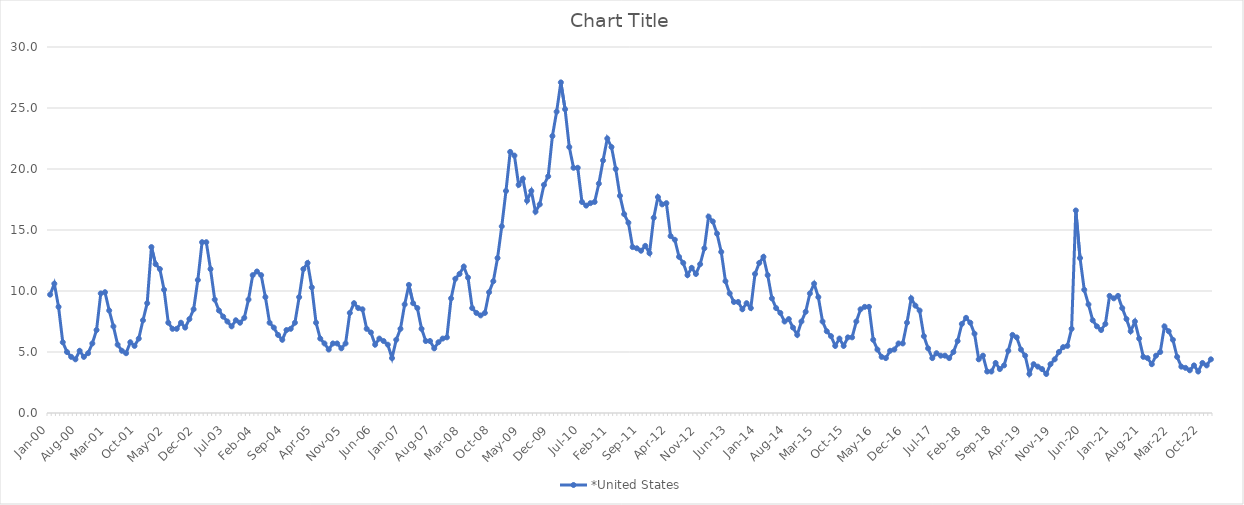
| Category | *United States | Alaska | Alabama | Arkansas | Arizona | California | Colorado | Connecticut | Delaware | Florida | Georgia | Hawaii | Iowa | Idaho | Illinois | Indiana | Kansas | Kentucky | Louisiana | Massachusetts | Maryland | Maine | Michigan | Minnesota | Missouri | Mississippi | Montana | North Carolina | North Dakota | Nebraska | New Hampshire | New Jersey | New Mexico | Nevada | New York | Ohio | Oklahoma | Oregon | Pennsylvania | Rhode Island | South Carolina | South Dakota | Tennessee | Texas | Utah | Virginia | Vermont | Washington | Wisconsin | West Virginia | Wyoming |
|---|---|---|---|---|---|---|---|---|---|---|---|---|---|---|---|---|---|---|---|---|---|---|---|---|---|---|---|---|---|---|---|---|---|---|---|---|---|---|---|---|---|---|---|---|---|---|---|---|---|---|---|
| Jan-00 | 9.7 |  |  |  |  |  |  |  |  |  |  |  |  |  |  |  |  |  |  |  |  |  |  |  |  |  |  |  |  |  |  |  |  |  |  |  |  |  |  |  |  |  |  |  |  |  |  |  |  |  |  |
| Feb-00 | 10.6 |  |  |  |  |  |  |  |  |  |  |  |  |  |  |  |  |  |  |  |  |  |  |  |  |  |  |  |  |  |  |  |  |  |  |  |  |  |  |  |  |  |  |  |  |  |  |  |  |  |  |
| Mar-00 | 8.7 |  |  |  |  |  |  |  |  |  |  |  |  |  |  |  |  |  |  |  |  |  |  |  |  |  |  |  |  |  |  |  |  |  |  |  |  |  |  |  |  |  |  |  |  |  |  |  |  |  |  |
| Apr-00 | 5.8 |  |  |  |  |  |  |  |  |  |  |  |  |  |  |  |  |  |  |  |  |  |  |  |  |  |  |  |  |  |  |  |  |  |  |  |  |  |  |  |  |  |  |  |  |  |  |  |  |  |  |
| May-00 | 5 |  |  |  |  |  |  |  |  |  |  |  |  |  |  |  |  |  |  |  |  |  |  |  |  |  |  |  |  |  |  |  |  |  |  |  |  |  |  |  |  |  |  |  |  |  |  |  |  |  |  |
| Jun-00 | 4.6 |  |  |  |  |  |  |  |  |  |  |  |  |  |  |  |  |  |  |  |  |  |  |  |  |  |  |  |  |  |  |  |  |  |  |  |  |  |  |  |  |  |  |  |  |  |  |  |  |  |  |
| Jul-00 | 4.4 |  |  |  |  |  |  |  |  |  |  |  |  |  |  |  |  |  |  |  |  |  |  |  |  |  |  |  |  |  |  |  |  |  |  |  |  |  |  |  |  |  |  |  |  |  |  |  |  |  |  |
| Aug-00 | 5.1 |  |  |  |  |  |  |  |  |  |  |  |  |  |  |  |  |  |  |  |  |  |  |  |  |  |  |  |  |  |  |  |  |  |  |  |  |  |  |  |  |  |  |  |  |  |  |  |  |  |  |
| Sep-00 | 4.6 |  |  |  |  |  |  |  |  |  |  |  |  |  |  |  |  |  |  |  |  |  |  |  |  |  |  |  |  |  |  |  |  |  |  |  |  |  |  |  |  |  |  |  |  |  |  |  |  |  |  |
| Oct-00 | 4.9 |  |  |  |  |  |  |  |  |  |  |  |  |  |  |  |  |  |  |  |  |  |  |  |  |  |  |  |  |  |  |  |  |  |  |  |  |  |  |  |  |  |  |  |  |  |  |  |  |  |  |
| Nov-00 | 5.7 |  |  |  |  |  |  |  |  |  |  |  |  |  |  |  |  |  |  |  |  |  |  |  |  |  |  |  |  |  |  |  |  |  |  |  |  |  |  |  |  |  |  |  |  |  |  |  |  |  |  |
| Dec-00 | 6.8 |  |  |  |  |  |  |  |  |  |  |  |  |  |  |  |  |  |  |  |  |  |  |  |  |  |  |  |  |  |  |  |  |  |  |  |  |  |  |  |  |  |  |  |  |  |  |  |  |  |  |
| Jan-01 | 9.8 |  |  |  |  |  |  |  |  |  |  |  |  |  |  |  |  |  |  |  |  |  |  |  |  |  |  |  |  |  |  |  |  |  |  |  |  |  |  |  |  |  |  |  |  |  |  |  |  |  |  |
| Feb-01 | 9.9 |  |  |  |  |  |  |  |  |  |  |  |  |  |  |  |  |  |  |  |  |  |  |  |  |  |  |  |  |  |  |  |  |  |  |  |  |  |  |  |  |  |  |  |  |  |  |  |  |  |  |
| Mar-01 | 8.4 |  |  |  |  |  |  |  |  |  |  |  |  |  |  |  |  |  |  |  |  |  |  |  |  |  |  |  |  |  |  |  |  |  |  |  |  |  |  |  |  |  |  |  |  |  |  |  |  |  |  |
| Apr-01 | 7.1 |  |  |  |  |  |  |  |  |  |  |  |  |  |  |  |  |  |  |  |  |  |  |  |  |  |  |  |  |  |  |  |  |  |  |  |  |  |  |  |  |  |  |  |  |  |  |  |  |  |  |
| May-01 | 5.6 |  |  |  |  |  |  |  |  |  |  |  |  |  |  |  |  |  |  |  |  |  |  |  |  |  |  |  |  |  |  |  |  |  |  |  |  |  |  |  |  |  |  |  |  |  |  |  |  |  |  |
| Jun-01 | 5.1 |  |  |  |  |  |  |  |  |  |  |  |  |  |  |  |  |  |  |  |  |  |  |  |  |  |  |  |  |  |  |  |  |  |  |  |  |  |  |  |  |  |  |  |  |  |  |  |  |  |  |
| Jul-01 | 4.9 |  |  |  |  |  |  |  |  |  |  |  |  |  |  |  |  |  |  |  |  |  |  |  |  |  |  |  |  |  |  |  |  |  |  |  |  |  |  |  |  |  |  |  |  |  |  |  |  |  |  |
| Aug-01 | 5.8 |  |  |  |  |  |  |  |  |  |  |  |  |  |  |  |  |  |  |  |  |  |  |  |  |  |  |  |  |  |  |  |  |  |  |  |  |  |  |  |  |  |  |  |  |  |  |  |  |  |  |
| Sep-01 | 5.5 |  |  |  |  |  |  |  |  |  |  |  |  |  |  |  |  |  |  |  |  |  |  |  |  |  |  |  |  |  |  |  |  |  |  |  |  |  |  |  |  |  |  |  |  |  |  |  |  |  |  |
| Oct-01 | 6.1 |  |  |  |  |  |  |  |  |  |  |  |  |  |  |  |  |  |  |  |  |  |  |  |  |  |  |  |  |  |  |  |  |  |  |  |  |  |  |  |  |  |  |  |  |  |  |  |  |  |  |
| Nov-01 | 7.6 |  |  |  |  |  |  |  |  |  |  |  |  |  |  |  |  |  |  |  |  |  |  |  |  |  |  |  |  |  |  |  |  |  |  |  |  |  |  |  |  |  |  |  |  |  |  |  |  |  |  |
| Dec-01 | 9 |  |  |  |  |  |  |  |  |  |  |  |  |  |  |  |  |  |  |  |  |  |  |  |  |  |  |  |  |  |  |  |  |  |  |  |  |  |  |  |  |  |  |  |  |  |  |  |  |  |  |
| Jan-02 | 13.6 |  |  |  |  |  |  |  |  |  |  |  |  |  |  |  |  |  |  |  |  |  |  |  |  |  |  |  |  |  |  |  |  |  |  |  |  |  |  |  |  |  |  |  |  |  |  |  |  |  |  |
| Feb-02 | 12.2 |  |  |  |  |  |  |  |  |  |  |  |  |  |  |  |  |  |  |  |  |  |  |  |  |  |  |  |  |  |  |  |  |  |  |  |  |  |  |  |  |  |  |  |  |  |  |  |  |  |  |
| Mar-02 | 11.8 |  |  |  |  |  |  |  |  |  |  |  |  |  |  |  |  |  |  |  |  |  |  |  |  |  |  |  |  |  |  |  |  |  |  |  |  |  |  |  |  |  |  |  |  |  |  |  |  |  |  |
| Apr-02 | 10.1 |  |  |  |  |  |  |  |  |  |  |  |  |  |  |  |  |  |  |  |  |  |  |  |  |  |  |  |  |  |  |  |  |  |  |  |  |  |  |  |  |  |  |  |  |  |  |  |  |  |  |
| May-02 | 7.4 |  |  |  |  |  |  |  |  |  |  |  |  |  |  |  |  |  |  |  |  |  |  |  |  |  |  |  |  |  |  |  |  |  |  |  |  |  |  |  |  |  |  |  |  |  |  |  |  |  |  |
| Jun-02 | 6.9 |  |  |  |  |  |  |  |  |  |  |  |  |  |  |  |  |  |  |  |  |  |  |  |  |  |  |  |  |  |  |  |  |  |  |  |  |  |  |  |  |  |  |  |  |  |  |  |  |  |  |
| Jul-02 | 6.9 |  |  |  |  |  |  |  |  |  |  |  |  |  |  |  |  |  |  |  |  |  |  |  |  |  |  |  |  |  |  |  |  |  |  |  |  |  |  |  |  |  |  |  |  |  |  |  |  |  |  |
| Aug-02 | 7.4 |  |  |  |  |  |  |  |  |  |  |  |  |  |  |  |  |  |  |  |  |  |  |  |  |  |  |  |  |  |  |  |  |  |  |  |  |  |  |  |  |  |  |  |  |  |  |  |  |  |  |
| Sep-02 | 7 |  |  |  |  |  |  |  |  |  |  |  |  |  |  |  |  |  |  |  |  |  |  |  |  |  |  |  |  |  |  |  |  |  |  |  |  |  |  |  |  |  |  |  |  |  |  |  |  |  |  |
| Oct-02 | 7.7 |  |  |  |  |  |  |  |  |  |  |  |  |  |  |  |  |  |  |  |  |  |  |  |  |  |  |  |  |  |  |  |  |  |  |  |  |  |  |  |  |  |  |  |  |  |  |  |  |  |  |
| Nov-02 | 8.5 |  |  |  |  |  |  |  |  |  |  |  |  |  |  |  |  |  |  |  |  |  |  |  |  |  |  |  |  |  |  |  |  |  |  |  |  |  |  |  |  |  |  |  |  |  |  |  |  |  |  |
| Dec-02 | 10.9 |  |  |  |  |  |  |  |  |  |  |  |  |  |  |  |  |  |  |  |  |  |  |  |  |  |  |  |  |  |  |  |  |  |  |  |  |  |  |  |  |  |  |  |  |  |  |  |  |  |  |
| Jan-03 | 14 |  |  |  |  |  |  |  |  |  |  |  |  |  |  |  |  |  |  |  |  |  |  |  |  |  |  |  |  |  |  |  |  |  |  |  |  |  |  |  |  |  |  |  |  |  |  |  |  |  |  |
| Feb-03 | 14 |  |  |  |  |  |  |  |  |  |  |  |  |  |  |  |  |  |  |  |  |  |  |  |  |  |  |  |  |  |  |  |  |  |  |  |  |  |  |  |  |  |  |  |  |  |  |  |  |  |  |
| Mar-03 | 11.8 |  |  |  |  |  |  |  |  |  |  |  |  |  |  |  |  |  |  |  |  |  |  |  |  |  |  |  |  |  |  |  |  |  |  |  |  |  |  |  |  |  |  |  |  |  |  |  |  |  |  |
| Apr-03 | 9.3 |  |  |  |  |  |  |  |  |  |  |  |  |  |  |  |  |  |  |  |  |  |  |  |  |  |  |  |  |  |  |  |  |  |  |  |  |  |  |  |  |  |  |  |  |  |  |  |  |  |  |
| May-03 | 8.4 |  |  |  |  |  |  |  |  |  |  |  |  |  |  |  |  |  |  |  |  |  |  |  |  |  |  |  |  |  |  |  |  |  |  |  |  |  |  |  |  |  |  |  |  |  |  |  |  |  |  |
| Jun-03 | 7.9 |  |  |  |  |  |  |  |  |  |  |  |  |  |  |  |  |  |  |  |  |  |  |  |  |  |  |  |  |  |  |  |  |  |  |  |  |  |  |  |  |  |  |  |  |  |  |  |  |  |  |
| Jul-03 | 7.5 |  |  |  |  |  |  |  |  |  |  |  |  |  |  |  |  |  |  |  |  |  |  |  |  |  |  |  |  |  |  |  |  |  |  |  |  |  |  |  |  |  |  |  |  |  |  |  |  |  |  |
| Aug-03 | 7.1 |  |  |  |  |  |  |  |  |  |  |  |  |  |  |  |  |  |  |  |  |  |  |  |  |  |  |  |  |  |  |  |  |  |  |  |  |  |  |  |  |  |  |  |  |  |  |  |  |  |  |
| Sep-03 | 7.6 |  |  |  |  |  |  |  |  |  |  |  |  |  |  |  |  |  |  |  |  |  |  |  |  |  |  |  |  |  |  |  |  |  |  |  |  |  |  |  |  |  |  |  |  |  |  |  |  |  |  |
| Oct-03 | 7.4 |  |  |  |  |  |  |  |  |  |  |  |  |  |  |  |  |  |  |  |  |  |  |  |  |  |  |  |  |  |  |  |  |  |  |  |  |  |  |  |  |  |  |  |  |  |  |  |  |  |  |
| Nov-03 | 7.8 |  |  |  |  |  |  |  |  |  |  |  |  |  |  |  |  |  |  |  |  |  |  |  |  |  |  |  |  |  |  |  |  |  |  |  |  |  |  |  |  |  |  |  |  |  |  |  |  |  |  |
| Dec-03 | 9.3 |  |  |  |  |  |  |  |  |  |  |  |  |  |  |  |  |  |  |  |  |  |  |  |  |  |  |  |  |  |  |  |  |  |  |  |  |  |  |  |  |  |  |  |  |  |  |  |  |  |  |
| Jan-04 | 11.3 |  |  |  |  |  |  |  |  |  |  |  |  |  |  |  |  |  |  |  |  |  |  |  |  |  |  |  |  |  |  |  |  |  |  |  |  |  |  |  |  |  |  |  |  |  |  |  |  |  |  |
| Feb-04 | 11.6 |  |  |  |  |  |  |  |  |  |  |  |  |  |  |  |  |  |  |  |  |  |  |  |  |  |  |  |  |  |  |  |  |  |  |  |  |  |  |  |  |  |  |  |  |  |  |  |  |  |  |
| Mar-04 | 11.3 |  |  |  |  |  |  |  |  |  |  |  |  |  |  |  |  |  |  |  |  |  |  |  |  |  |  |  |  |  |  |  |  |  |  |  |  |  |  |  |  |  |  |  |  |  |  |  |  |  |  |
| Apr-04 | 9.5 |  |  |  |  |  |  |  |  |  |  |  |  |  |  |  |  |  |  |  |  |  |  |  |  |  |  |  |  |  |  |  |  |  |  |  |  |  |  |  |  |  |  |  |  |  |  |  |  |  |  |
| May-04 | 7.4 |  |  |  |  |  |  |  |  |  |  |  |  |  |  |  |  |  |  |  |  |  |  |  |  |  |  |  |  |  |  |  |  |  |  |  |  |  |  |  |  |  |  |  |  |  |  |  |  |  |  |
| Jun-04 | 7 |  |  |  |  |  |  |  |  |  |  |  |  |  |  |  |  |  |  |  |  |  |  |  |  |  |  |  |  |  |  |  |  |  |  |  |  |  |  |  |  |  |  |  |  |  |  |  |  |  |  |
| Jul-04 | 6.4 |  |  |  |  |  |  |  |  |  |  |  |  |  |  |  |  |  |  |  |  |  |  |  |  |  |  |  |  |  |  |  |  |  |  |  |  |  |  |  |  |  |  |  |  |  |  |  |  |  |  |
| Aug-04 | 6 |  |  |  |  |  |  |  |  |  |  |  |  |  |  |  |  |  |  |  |  |  |  |  |  |  |  |  |  |  |  |  |  |  |  |  |  |  |  |  |  |  |  |  |  |  |  |  |  |  |  |
| Sep-04 | 6.8 |  |  |  |  |  |  |  |  |  |  |  |  |  |  |  |  |  |  |  |  |  |  |  |  |  |  |  |  |  |  |  |  |  |  |  |  |  |  |  |  |  |  |  |  |  |  |  |  |  |  |
| Oct-04 | 6.9 |  |  |  |  |  |  |  |  |  |  |  |  |  |  |  |  |  |  |  |  |  |  |  |  |  |  |  |  |  |  |  |  |  |  |  |  |  |  |  |  |  |  |  |  |  |  |  |  |  |  |
| Nov-04 | 7.4 |  |  |  |  |  |  |  |  |  |  |  |  |  |  |  |  |  |  |  |  |  |  |  |  |  |  |  |  |  |  |  |  |  |  |  |  |  |  |  |  |  |  |  |  |  |  |  |  |  |  |
| Dec-04 | 9.5 |  |  |  |  |  |  |  |  |  |  |  |  |  |  |  |  |  |  |  |  |  |  |  |  |  |  |  |  |  |  |  |  |  |  |  |  |  |  |  |  |  |  |  |  |  |  |  |  |  |  |
| Jan-05 | 11.8 |  |  |  |  |  |  |  |  |  |  |  |  |  |  |  |  |  |  |  |  |  |  |  |  |  |  |  |  |  |  |  |  |  |  |  |  |  |  |  |  |  |  |  |  |  |  |  |  |  |  |
| Feb-05 | 12.3 |  |  |  |  |  |  |  |  |  |  |  |  |  |  |  |  |  |  |  |  |  |  |  |  |  |  |  |  |  |  |  |  |  |  |  |  |  |  |  |  |  |  |  |  |  |  |  |  |  |  |
| Mar-05 | 10.3 |  |  |  |  |  |  |  |  |  |  |  |  |  |  |  |  |  |  |  |  |  |  |  |  |  |  |  |  |  |  |  |  |  |  |  |  |  |  |  |  |  |  |  |  |  |  |  |  |  |  |
| Apr-05 | 7.4 |  |  |  |  |  |  |  |  |  |  |  |  |  |  |  |  |  |  |  |  |  |  |  |  |  |  |  |  |  |  |  |  |  |  |  |  |  |  |  |  |  |  |  |  |  |  |  |  |  |  |
| May-05 | 6.1 |  |  |  |  |  |  |  |  |  |  |  |  |  |  |  |  |  |  |  |  |  |  |  |  |  |  |  |  |  |  |  |  |  |  |  |  |  |  |  |  |  |  |  |  |  |  |  |  |  |  |
| Jun-05 | 5.7 |  |  |  |  |  |  |  |  |  |  |  |  |  |  |  |  |  |  |  |  |  |  |  |  |  |  |  |  |  |  |  |  |  |  |  |  |  |  |  |  |  |  |  |  |  |  |  |  |  |  |
| Jul-05 | 5.2 |  |  |  |  |  |  |  |  |  |  |  |  |  |  |  |  |  |  |  |  |  |  |  |  |  |  |  |  |  |  |  |  |  |  |  |  |  |  |  |  |  |  |  |  |  |  |  |  |  |  |
| Aug-05 | 5.7 |  |  |  |  |  |  |  |  |  |  |  |  |  |  |  |  |  |  |  |  |  |  |  |  |  |  |  |  |  |  |  |  |  |  |  |  |  |  |  |  |  |  |  |  |  |  |  |  |  |  |
| Sep-05 | 5.7 |  |  |  |  |  |  |  |  |  |  |  |  |  |  |  |  |  |  |  |  |  |  |  |  |  |  |  |  |  |  |  |  |  |  |  |  |  |  |  |  |  |  |  |  |  |  |  |  |  |  |
| Oct-05 | 5.3 |  |  |  |  |  |  |  |  |  |  |  |  |  |  |  |  |  |  |  |  |  |  |  |  |  |  |  |  |  |  |  |  |  |  |  |  |  |  |  |  |  |  |  |  |  |  |  |  |  |  |
| Nov-05 | 5.7 |  |  |  |  |  |  |  |  |  |  |  |  |  |  |  |  |  |  |  |  |  |  |  |  |  |  |  |  |  |  |  |  |  |  |  |  |  |  |  |  |  |  |  |  |  |  |  |  |  |  |
| Dec-05 | 8.2 |  |  |  |  |  |  |  |  |  |  |  |  |  |  |  |  |  |  |  |  |  |  |  |  |  |  |  |  |  |  |  |  |  |  |  |  |  |  |  |  |  |  |  |  |  |  |  |  |  |  |
| Jan-06 | 9 |  |  |  |  |  |  |  |  |  |  |  |  |  |  |  |  |  |  |  |  |  |  |  |  |  |  |  |  |  |  |  |  |  |  |  |  |  |  |  |  |  |  |  |  |  |  |  |  |  |  |
| Feb-06 | 8.6 |  |  |  |  |  |  |  |  |  |  |  |  |  |  |  |  |  |  |  |  |  |  |  |  |  |  |  |  |  |  |  |  |  |  |  |  |  |  |  |  |  |  |  |  |  |  |  |  |  |  |
| Mar-06 | 8.5 |  |  |  |  |  |  |  |  |  |  |  |  |  |  |  |  |  |  |  |  |  |  |  |  |  |  |  |  |  |  |  |  |  |  |  |  |  |  |  |  |  |  |  |  |  |  |  |  |  |  |
| Apr-06 | 6.9 |  |  |  |  |  |  |  |  |  |  |  |  |  |  |  |  |  |  |  |  |  |  |  |  |  |  |  |  |  |  |  |  |  |  |  |  |  |  |  |  |  |  |  |  |  |  |  |  |  |  |
| May-06 | 6.6 |  |  |  |  |  |  |  |  |  |  |  |  |  |  |  |  |  |  |  |  |  |  |  |  |  |  |  |  |  |  |  |  |  |  |  |  |  |  |  |  |  |  |  |  |  |  |  |  |  |  |
| Jun-06 | 5.6 |  |  |  |  |  |  |  |  |  |  |  |  |  |  |  |  |  |  |  |  |  |  |  |  |  |  |  |  |  |  |  |  |  |  |  |  |  |  |  |  |  |  |  |  |  |  |  |  |  |  |
| Jul-06 | 6.1 |  |  |  |  |  |  |  |  |  |  |  |  |  |  |  |  |  |  |  |  |  |  |  |  |  |  |  |  |  |  |  |  |  |  |  |  |  |  |  |  |  |  |  |  |  |  |  |  |  |  |
| Aug-06 | 5.9 |  |  |  |  |  |  |  |  |  |  |  |  |  |  |  |  |  |  |  |  |  |  |  |  |  |  |  |  |  |  |  |  |  |  |  |  |  |  |  |  |  |  |  |  |  |  |  |  |  |  |
| Sep-06 | 5.6 |  |  |  |  |  |  |  |  |  |  |  |  |  |  |  |  |  |  |  |  |  |  |  |  |  |  |  |  |  |  |  |  |  |  |  |  |  |  |  |  |  |  |  |  |  |  |  |  |  |  |
| Oct-06 | 4.5 |  |  |  |  |  |  |  |  |  |  |  |  |  |  |  |  |  |  |  |  |  |  |  |  |  |  |  |  |  |  |  |  |  |  |  |  |  |  |  |  |  |  |  |  |  |  |  |  |  |  |
| Nov-06 | 6 |  |  |  |  |  |  |  |  |  |  |  |  |  |  |  |  |  |  |  |  |  |  |  |  |  |  |  |  |  |  |  |  |  |  |  |  |  |  |  |  |  |  |  |  |  |  |  |  |  |  |
| Dec-06 | 6.9 |  |  |  |  |  |  |  |  |  |  |  |  |  |  |  |  |  |  |  |  |  |  |  |  |  |  |  |  |  |  |  |  |  |  |  |  |  |  |  |  |  |  |  |  |  |  |  |  |  |  |
| Jan-07 | 8.9 |  |  |  |  |  |  |  |  |  |  |  |  |  |  |  |  |  |  |  |  |  |  |  |  |  |  |  |  |  |  |  |  |  |  |  |  |  |  |  |  |  |  |  |  |  |  |  |  |  |  |
| Feb-07 | 10.5 |  |  |  |  |  |  |  |  |  |  |  |  |  |  |  |  |  |  |  |  |  |  |  |  |  |  |  |  |  |  |  |  |  |  |  |  |  |  |  |  |  |  |  |  |  |  |  |  |  |  |
| Mar-07 | 9 |  |  |  |  |  |  |  |  |  |  |  |  |  |  |  |  |  |  |  |  |  |  |  |  |  |  |  |  |  |  |  |  |  |  |  |  |  |  |  |  |  |  |  |  |  |  |  |  |  |  |
| Apr-07 | 8.6 |  |  |  |  |  |  |  |  |  |  |  |  |  |  |  |  |  |  |  |  |  |  |  |  |  |  |  |  |  |  |  |  |  |  |  |  |  |  |  |  |  |  |  |  |  |  |  |  |  |  |
| May-07 | 6.9 |  |  |  |  |  |  |  |  |  |  |  |  |  |  |  |  |  |  |  |  |  |  |  |  |  |  |  |  |  |  |  |  |  |  |  |  |  |  |  |  |  |  |  |  |  |  |  |  |  |  |
| Jun-07 | 5.9 |  |  |  |  |  |  |  |  |  |  |  |  |  |  |  |  |  |  |  |  |  |  |  |  |  |  |  |  |  |  |  |  |  |  |  |  |  |  |  |  |  |  |  |  |  |  |  |  |  |  |
| Jul-07 | 5.9 |  |  |  |  |  |  |  |  |  |  |  |  |  |  |  |  |  |  |  |  |  |  |  |  |  |  |  |  |  |  |  |  |  |  |  |  |  |  |  |  |  |  |  |  |  |  |  |  |  |  |
| Aug-07 | 5.3 |  |  |  |  |  |  |  |  |  |  |  |  |  |  |  |  |  |  |  |  |  |  |  |  |  |  |  |  |  |  |  |  |  |  |  |  |  |  |  |  |  |  |  |  |  |  |  |  |  |  |
| Sep-07 | 5.8 |  |  |  |  |  |  |  |  |  |  |  |  |  |  |  |  |  |  |  |  |  |  |  |  |  |  |  |  |  |  |  |  |  |  |  |  |  |  |  |  |  |  |  |  |  |  |  |  |  |  |
| Oct-07 | 6.1 |  |  |  |  |  |  |  |  |  |  |  |  |  |  |  |  |  |  |  |  |  |  |  |  |  |  |  |  |  |  |  |  |  |  |  |  |  |  |  |  |  |  |  |  |  |  |  |  |  |  |
| Nov-07 | 6.2 |  |  |  |  |  |  |  |  |  |  |  |  |  |  |  |  |  |  |  |  |  |  |  |  |  |  |  |  |  |  |  |  |  |  |  |  |  |  |  |  |  |  |  |  |  |  |  |  |  |  |
| Dec-07 | 9.4 |  |  |  |  |  |  |  |  |  |  |  |  |  |  |  |  |  |  |  |  |  |  |  |  |  |  |  |  |  |  |  |  |  |  |  |  |  |  |  |  |  |  |  |  |  |  |  |  |  |  |
| Jan-08 | 11 |  |  |  |  |  |  |  |  |  |  |  |  |  |  |  |  |  |  |  |  |  |  |  |  |  |  |  |  |  |  |  |  |  |  |  |  |  |  |  |  |  |  |  |  |  |  |  |  |  |  |
| Feb-08 | 11.4 |  |  |  |  |  |  |  |  |  |  |  |  |  |  |  |  |  |  |  |  |  |  |  |  |  |  |  |  |  |  |  |  |  |  |  |  |  |  |  |  |  |  |  |  |  |  |  |  |  |  |
| Mar-08 | 12 |  |  |  |  |  |  |  |  |  |  |  |  |  |  |  |  |  |  |  |  |  |  |  |  |  |  |  |  |  |  |  |  |  |  |  |  |  |  |  |  |  |  |  |  |  |  |  |  |  |  |
| Apr-08 | 11.1 |  |  |  |  |  |  |  |  |  |  |  |  |  |  |  |  |  |  |  |  |  |  |  |  |  |  |  |  |  |  |  |  |  |  |  |  |  |  |  |  |  |  |  |  |  |  |  |  |  |  |
| May-08 | 8.6 |  |  |  |  |  |  |  |  |  |  |  |  |  |  |  |  |  |  |  |  |  |  |  |  |  |  |  |  |  |  |  |  |  |  |  |  |  |  |  |  |  |  |  |  |  |  |  |  |  |  |
| Jun-08 | 8.2 |  |  |  |  |  |  |  |  |  |  |  |  |  |  |  |  |  |  |  |  |  |  |  |  |  |  |  |  |  |  |  |  |  |  |  |  |  |  |  |  |  |  |  |  |  |  |  |  |  |  |
| Jul-08 | 8 |  |  |  |  |  |  |  |  |  |  |  |  |  |  |  |  |  |  |  |  |  |  |  |  |  |  |  |  |  |  |  |  |  |  |  |  |  |  |  |  |  |  |  |  |  |  |  |  |  |  |
| Aug-08 | 8.2 |  |  |  |  |  |  |  |  |  |  |  |  |  |  |  |  |  |  |  |  |  |  |  |  |  |  |  |  |  |  |  |  |  |  |  |  |  |  |  |  |  |  |  |  |  |  |  |  |  |  |
| Sep-08 | 9.9 |  |  |  |  |  |  |  |  |  |  |  |  |  |  |  |  |  |  |  |  |  |  |  |  |  |  |  |  |  |  |  |  |  |  |  |  |  |  |  |  |  |  |  |  |  |  |  |  |  |  |
| Oct-08 | 10.8 |  |  |  |  |  |  |  |  |  |  |  |  |  |  |  |  |  |  |  |  |  |  |  |  |  |  |  |  |  |  |  |  |  |  |  |  |  |  |  |  |  |  |  |  |  |  |  |  |  |  |
| Nov-08 | 12.7 |  |  |  |  |  |  |  |  |  |  |  |  |  |  |  |  |  |  |  |  |  |  |  |  |  |  |  |  |  |  |  |  |  |  |  |  |  |  |  |  |  |  |  |  |  |  |  |  |  |  |
| Dec-08 | 15.3 |  |  |  |  |  |  |  |  |  |  |  |  |  |  |  |  |  |  |  |  |  |  |  |  |  |  |  |  |  |  |  |  |  |  |  |  |  |  |  |  |  |  |  |  |  |  |  |  |  |  |
| Jan-09 | 18.2 |  |  |  |  |  |  |  |  |  |  |  |  |  |  |  |  |  |  |  |  |  |  |  |  |  |  |  |  |  |  |  |  |  |  |  |  |  |  |  |  |  |  |  |  |  |  |  |  |  |  |
| Feb-09 | 21.4 |  |  |  |  |  |  |  |  |  |  |  |  |  |  |  |  |  |  |  |  |  |  |  |  |  |  |  |  |  |  |  |  |  |  |  |  |  |  |  |  |  |  |  |  |  |  |  |  |  |  |
| Mar-09 | 21.1 |  |  |  |  |  |  |  |  |  |  |  |  |  |  |  |  |  |  |  |  |  |  |  |  |  |  |  |  |  |  |  |  |  |  |  |  |  |  |  |  |  |  |  |  |  |  |  |  |  |  |
| Apr-09 | 18.7 |  |  |  |  |  |  |  |  |  |  |  |  |  |  |  |  |  |  |  |  |  |  |  |  |  |  |  |  |  |  |  |  |  |  |  |  |  |  |  |  |  |  |  |  |  |  |  |  |  |  |
| May-09 | 19.2 |  |  |  |  |  |  |  |  |  |  |  |  |  |  |  |  |  |  |  |  |  |  |  |  |  |  |  |  |  |  |  |  |  |  |  |  |  |  |  |  |  |  |  |  |  |  |  |  |  |  |
| Jun-09 | 17.4 |  |  |  |  |  |  |  |  |  |  |  |  |  |  |  |  |  |  |  |  |  |  |  |  |  |  |  |  |  |  |  |  |  |  |  |  |  |  |  |  |  |  |  |  |  |  |  |  |  |  |
| Jul-09 | 18.2 |  |  |  |  |  |  |  |  |  |  |  |  |  |  |  |  |  |  |  |  |  |  |  |  |  |  |  |  |  |  |  |  |  |  |  |  |  |  |  |  |  |  |  |  |  |  |  |  |  |  |
| Aug-09 | 16.5 |  |  |  |  |  |  |  |  |  |  |  |  |  |  |  |  |  |  |  |  |  |  |  |  |  |  |  |  |  |  |  |  |  |  |  |  |  |  |  |  |  |  |  |  |  |  |  |  |  |  |
| Sep-09 | 17.1 |  |  |  |  |  |  |  |  |  |  |  |  |  |  |  |  |  |  |  |  |  |  |  |  |  |  |  |  |  |  |  |  |  |  |  |  |  |  |  |  |  |  |  |  |  |  |  |  |  |  |
| Oct-09 | 18.7 |  |  |  |  |  |  |  |  |  |  |  |  |  |  |  |  |  |  |  |  |  |  |  |  |  |  |  |  |  |  |  |  |  |  |  |  |  |  |  |  |  |  |  |  |  |  |  |  |  |  |
| Nov-09 | 19.4 |  |  |  |  |  |  |  |  |  |  |  |  |  |  |  |  |  |  |  |  |  |  |  |  |  |  |  |  |  |  |  |  |  |  |  |  |  |  |  |  |  |  |  |  |  |  |  |  |  |  |
| Dec-09 | 22.7 |  |  |  |  |  |  |  |  |  |  |  |  |  |  |  |  |  |  |  |  |  |  |  |  |  |  |  |  |  |  |  |  |  |  |  |  |  |  |  |  |  |  |  |  |  |  |  |  |  |  |
| Jan-10 | 24.7 |  |  |  |  |  |  |  |  |  |  |  |  |  |  |  |  |  |  |  |  |  |  |  |  |  |  |  |  |  |  |  |  |  |  |  |  |  |  |  |  |  |  |  |  |  |  |  |  |  |  |
| Feb-10 | 27.1 |  |  |  |  |  |  |  |  |  |  |  |  |  |  |  |  |  |  |  |  |  |  |  |  |  |  |  |  |  |  |  |  |  |  |  |  |  |  |  |  |  |  |  |  |  |  |  |  |  |  |
| Mar-10 | 24.9 |  |  |  |  |  |  |  |  |  |  |  |  |  |  |  |  |  |  |  |  |  |  |  |  |  |  |  |  |  |  |  |  |  |  |  |  |  |  |  |  |  |  |  |  |  |  |  |  |  |  |
| Apr-10 | 21.8 |  |  |  |  |  |  |  |  |  |  |  |  |  |  |  |  |  |  |  |  |  |  |  |  |  |  |  |  |  |  |  |  |  |  |  |  |  |  |  |  |  |  |  |  |  |  |  |  |  |  |
| May-10 | 20.1 |  |  |  |  |  |  |  |  |  |  |  |  |  |  |  |  |  |  |  |  |  |  |  |  |  |  |  |  |  |  |  |  |  |  |  |  |  |  |  |  |  |  |  |  |  |  |  |  |  |  |
| Jun-10 | 20.1 |  |  |  |  |  |  |  |  |  |  |  |  |  |  |  |  |  |  |  |  |  |  |  |  |  |  |  |  |  |  |  |  |  |  |  |  |  |  |  |  |  |  |  |  |  |  |  |  |  |  |
| Jul-10 | 17.3 |  |  |  |  |  |  |  |  |  |  |  |  |  |  |  |  |  |  |  |  |  |  |  |  |  |  |  |  |  |  |  |  |  |  |  |  |  |  |  |  |  |  |  |  |  |  |  |  |  |  |
| Aug-10 | 17 |  |  |  |  |  |  |  |  |  |  |  |  |  |  |  |  |  |  |  |  |  |  |  |  |  |  |  |  |  |  |  |  |  |  |  |  |  |  |  |  |  |  |  |  |  |  |  |  |  |  |
| Sep-10 | 17.2 |  |  |  |  |  |  |  |  |  |  |  |  |  |  |  |  |  |  |  |  |  |  |  |  |  |  |  |  |  |  |  |  |  |  |  |  |  |  |  |  |  |  |  |  |  |  |  |  |  |  |
| Oct-10 | 17.3 |  |  |  |  |  |  |  |  |  |  |  |  |  |  |  |  |  |  |  |  |  |  |  |  |  |  |  |  |  |  |  |  |  |  |  |  |  |  |  |  |  |  |  |  |  |  |  |  |  |  |
| Nov-10 | 18.8 |  |  |  |  |  |  |  |  |  |  |  |  |  |  |  |  |  |  |  |  |  |  |  |  |  |  |  |  |  |  |  |  |  |  |  |  |  |  |  |  |  |  |  |  |  |  |  |  |  |  |
| Dec-10 | 20.7 |  |  |  |  |  |  |  |  |  |  |  |  |  |  |  |  |  |  |  |  |  |  |  |  |  |  |  |  |  |  |  |  |  |  |  |  |  |  |  |  |  |  |  |  |  |  |  |  |  |  |
| Jan-11 | 22.5 |  |  |  |  |  |  |  |  |  |  |  |  |  |  |  |  |  |  |  |  |  |  |  |  |  |  |  |  |  |  |  |  |  |  |  |  |  |  |  |  |  |  |  |  |  |  |  |  |  |  |
| Feb-11 | 21.8 |  |  |  |  |  |  |  |  |  |  |  |  |  |  |  |  |  |  |  |  |  |  |  |  |  |  |  |  |  |  |  |  |  |  |  |  |  |  |  |  |  |  |  |  |  |  |  |  |  |  |
| Mar-11 | 20 |  |  |  |  |  |  |  |  |  |  |  |  |  |  |  |  |  |  |  |  |  |  |  |  |  |  |  |  |  |  |  |  |  |  |  |  |  |  |  |  |  |  |  |  |  |  |  |  |  |  |
| Apr-11 | 17.8 |  |  |  |  |  |  |  |  |  |  |  |  |  |  |  |  |  |  |  |  |  |  |  |  |  |  |  |  |  |  |  |  |  |  |  |  |  |  |  |  |  |  |  |  |  |  |  |  |  |  |
| May-11 | 16.3 |  |  |  |  |  |  |  |  |  |  |  |  |  |  |  |  |  |  |  |  |  |  |  |  |  |  |  |  |  |  |  |  |  |  |  |  |  |  |  |  |  |  |  |  |  |  |  |  |  |  |
| Jun-11 | 15.6 |  |  |  |  |  |  |  |  |  |  |  |  |  |  |  |  |  |  |  |  |  |  |  |  |  |  |  |  |  |  |  |  |  |  |  |  |  |  |  |  |  |  |  |  |  |  |  |  |  |  |
| Jul-11 | 13.6 |  |  |  |  |  |  |  |  |  |  |  |  |  |  |  |  |  |  |  |  |  |  |  |  |  |  |  |  |  |  |  |  |  |  |  |  |  |  |  |  |  |  |  |  |  |  |  |  |  |  |
| Aug-11 | 13.5 |  |  |  |  |  |  |  |  |  |  |  |  |  |  |  |  |  |  |  |  |  |  |  |  |  |  |  |  |  |  |  |  |  |  |  |  |  |  |  |  |  |  |  |  |  |  |  |  |  |  |
| Sep-11 | 13.3 |  |  |  |  |  |  |  |  |  |  |  |  |  |  |  |  |  |  |  |  |  |  |  |  |  |  |  |  |  |  |  |  |  |  |  |  |  |  |  |  |  |  |  |  |  |  |  |  |  |  |
| Oct-11 | 13.7 |  |  |  |  |  |  |  |  |  |  |  |  |  |  |  |  |  |  |  |  |  |  |  |  |  |  |  |  |  |  |  |  |  |  |  |  |  |  |  |  |  |  |  |  |  |  |  |  |  |  |
| Nov-11 | 13.1 |  |  |  |  |  |  |  |  |  |  |  |  |  |  |  |  |  |  |  |  |  |  |  |  |  |  |  |  |  |  |  |  |  |  |  |  |  |  |  |  |  |  |  |  |  |  |  |  |  |  |
| Dec-11 | 16 |  |  |  |  |  |  |  |  |  |  |  |  |  |  |  |  |  |  |  |  |  |  |  |  |  |  |  |  |  |  |  |  |  |  |  |  |  |  |  |  |  |  |  |  |  |  |  |  |  |  |
| Jan-12 | 17.7 |  |  |  |  |  |  |  |  |  |  |  |  |  |  |  |  |  |  |  |  |  |  |  |  |  |  |  |  |  |  |  |  |  |  |  |  |  |  |  |  |  |  |  |  |  |  |  |  |  |  |
| Feb-12 | 17.1 |  |  |  |  |  |  |  |  |  |  |  |  |  |  |  |  |  |  |  |  |  |  |  |  |  |  |  |  |  |  |  |  |  |  |  |  |  |  |  |  |  |  |  |  |  |  |  |  |  |  |
| Mar-12 | 17.2 |  |  |  |  |  |  |  |  |  |  |  |  |  |  |  |  |  |  |  |  |  |  |  |  |  |  |  |  |  |  |  |  |  |  |  |  |  |  |  |  |  |  |  |  |  |  |  |  |  |  |
| Apr-12 | 14.5 |  |  |  |  |  |  |  |  |  |  |  |  |  |  |  |  |  |  |  |  |  |  |  |  |  |  |  |  |  |  |  |  |  |  |  |  |  |  |  |  |  |  |  |  |  |  |  |  |  |  |
| May-12 | 14.2 |  |  |  |  |  |  |  |  |  |  |  |  |  |  |  |  |  |  |  |  |  |  |  |  |  |  |  |  |  |  |  |  |  |  |  |  |  |  |  |  |  |  |  |  |  |  |  |  |  |  |
| Jun-12 | 12.8 |  |  |  |  |  |  |  |  |  |  |  |  |  |  |  |  |  |  |  |  |  |  |  |  |  |  |  |  |  |  |  |  |  |  |  |  |  |  |  |  |  |  |  |  |  |  |  |  |  |  |
| Jul-12 | 12.3 |  |  |  |  |  |  |  |  |  |  |  |  |  |  |  |  |  |  |  |  |  |  |  |  |  |  |  |  |  |  |  |  |  |  |  |  |  |  |  |  |  |  |  |  |  |  |  |  |  |  |
| Aug-12 | 11.3 |  |  |  |  |  |  |  |  |  |  |  |  |  |  |  |  |  |  |  |  |  |  |  |  |  |  |  |  |  |  |  |  |  |  |  |  |  |  |  |  |  |  |  |  |  |  |  |  |  |  |
| Sep-12 | 11.9 |  |  |  |  |  |  |  |  |  |  |  |  |  |  |  |  |  |  |  |  |  |  |  |  |  |  |  |  |  |  |  |  |  |  |  |  |  |  |  |  |  |  |  |  |  |  |  |  |  |  |
| Oct-12 | 11.4 |  |  |  |  |  |  |  |  |  |  |  |  |  |  |  |  |  |  |  |  |  |  |  |  |  |  |  |  |  |  |  |  |  |  |  |  |  |  |  |  |  |  |  |  |  |  |  |  |  |  |
| Nov-12 | 12.2 |  |  |  |  |  |  |  |  |  |  |  |  |  |  |  |  |  |  |  |  |  |  |  |  |  |  |  |  |  |  |  |  |  |  |  |  |  |  |  |  |  |  |  |  |  |  |  |  |  |  |
| Dec-12 | 13.5 |  |  |  |  |  |  |  |  |  |  |  |  |  |  |  |  |  |  |  |  |  |  |  |  |  |  |  |  |  |  |  |  |  |  |  |  |  |  |  |  |  |  |  |  |  |  |  |  |  |  |
| Jan-13 | 16.1 |  |  |  |  |  |  |  |  |  |  |  |  |  |  |  |  |  |  |  |  |  |  |  |  |  |  |  |  |  |  |  |  |  |  |  |  |  |  |  |  |  |  |  |  |  |  |  |  |  |  |
| Feb-13 | 15.7 |  |  |  |  |  |  |  |  |  |  |  |  |  |  |  |  |  |  |  |  |  |  |  |  |  |  |  |  |  |  |  |  |  |  |  |  |  |  |  |  |  |  |  |  |  |  |  |  |  |  |
| Mar-13 | 14.7 |  |  |  |  |  |  |  |  |  |  |  |  |  |  |  |  |  |  |  |  |  |  |  |  |  |  |  |  |  |  |  |  |  |  |  |  |  |  |  |  |  |  |  |  |  |  |  |  |  |  |
| Apr-13 | 13.2 |  |  |  |  |  |  |  |  |  |  |  |  |  |  |  |  |  |  |  |  |  |  |  |  |  |  |  |  |  |  |  |  |  |  |  |  |  |  |  |  |  |  |  |  |  |  |  |  |  |  |
| May-13 | 10.8 |  |  |  |  |  |  |  |  |  |  |  |  |  |  |  |  |  |  |  |  |  |  |  |  |  |  |  |  |  |  |  |  |  |  |  |  |  |  |  |  |  |  |  |  |  |  |  |  |  |  |
| Jun-13 | 9.8 |  |  |  |  |  |  |  |  |  |  |  |  |  |  |  |  |  |  |  |  |  |  |  |  |  |  |  |  |  |  |  |  |  |  |  |  |  |  |  |  |  |  |  |  |  |  |  |  |  |  |
| Jul-13 | 9.1 |  |  |  |  |  |  |  |  |  |  |  |  |  |  |  |  |  |  |  |  |  |  |  |  |  |  |  |  |  |  |  |  |  |  |  |  |  |  |  |  |  |  |  |  |  |  |  |  |  |  |
| Aug-13 | 9.1 |  |  |  |  |  |  |  |  |  |  |  |  |  |  |  |  |  |  |  |  |  |  |  |  |  |  |  |  |  |  |  |  |  |  |  |  |  |  |  |  |  |  |  |  |  |  |  |  |  |  |
| Sep-13 | 8.5 |  |  |  |  |  |  |  |  |  |  |  |  |  |  |  |  |  |  |  |  |  |  |  |  |  |  |  |  |  |  |  |  |  |  |  |  |  |  |  |  |  |  |  |  |  |  |  |  |  |  |
| Oct-13 | 9 |  |  |  |  |  |  |  |  |  |  |  |  |  |  |  |  |  |  |  |  |  |  |  |  |  |  |  |  |  |  |  |  |  |  |  |  |  |  |  |  |  |  |  |  |  |  |  |  |  |  |
| Nov-13 | 8.6 |  |  |  |  |  |  |  |  |  |  |  |  |  |  |  |  |  |  |  |  |  |  |  |  |  |  |  |  |  |  |  |  |  |  |  |  |  |  |  |  |  |  |  |  |  |  |  |  |  |  |
| Dec-13 | 11.4 |  |  |  |  |  |  |  |  |  |  |  |  |  |  |  |  |  |  |  |  |  |  |  |  |  |  |  |  |  |  |  |  |  |  |  |  |  |  |  |  |  |  |  |  |  |  |  |  |  |  |
| Jan-14 | 12.3 |  |  |  |  |  |  |  |  |  |  |  |  |  |  |  |  |  |  |  |  |  |  |  |  |  |  |  |  |  |  |  |  |  |  |  |  |  |  |  |  |  |  |  |  |  |  |  |  |  |  |
| Feb-14 | 12.8 |  |  |  |  |  |  |  |  |  |  |  |  |  |  |  |  |  |  |  |  |  |  |  |  |  |  |  |  |  |  |  |  |  |  |  |  |  |  |  |  |  |  |  |  |  |  |  |  |  |  |
| Mar-14 | 11.3 |  |  |  |  |  |  |  |  |  |  |  |  |  |  |  |  |  |  |  |  |  |  |  |  |  |  |  |  |  |  |  |  |  |  |  |  |  |  |  |  |  |  |  |  |  |  |  |  |  |  |
| Apr-14 | 9.4 |  |  |  |  |  |  |  |  |  |  |  |  |  |  |  |  |  |  |  |  |  |  |  |  |  |  |  |  |  |  |  |  |  |  |  |  |  |  |  |  |  |  |  |  |  |  |  |  |  |  |
| May-14 | 8.6 |  |  |  |  |  |  |  |  |  |  |  |  |  |  |  |  |  |  |  |  |  |  |  |  |  |  |  |  |  |  |  |  |  |  |  |  |  |  |  |  |  |  |  |  |  |  |  |  |  |  |
| Jun-14 | 8.2 |  |  |  |  |  |  |  |  |  |  |  |  |  |  |  |  |  |  |  |  |  |  |  |  |  |  |  |  |  |  |  |  |  |  |  |  |  |  |  |  |  |  |  |  |  |  |  |  |  |  |
| Jul-14 | 7.5 |  |  |  |  |  |  |  |  |  |  |  |  |  |  |  |  |  |  |  |  |  |  |  |  |  |  |  |  |  |  |  |  |  |  |  |  |  |  |  |  |  |  |  |  |  |  |  |  |  |  |
| Aug-14 | 7.7 |  |  |  |  |  |  |  |  |  |  |  |  |  |  |  |  |  |  |  |  |  |  |  |  |  |  |  |  |  |  |  |  |  |  |  |  |  |  |  |  |  |  |  |  |  |  |  |  |  |  |
| Sep-14 | 7 |  |  |  |  |  |  |  |  |  |  |  |  |  |  |  |  |  |  |  |  |  |  |  |  |  |  |  |  |  |  |  |  |  |  |  |  |  |  |  |  |  |  |  |  |  |  |  |  |  |  |
| Oct-14 | 6.4 |  |  |  |  |  |  |  |  |  |  |  |  |  |  |  |  |  |  |  |  |  |  |  |  |  |  |  |  |  |  |  |  |  |  |  |  |  |  |  |  |  |  |  |  |  |  |  |  |  |  |
| Nov-14 | 7.5 |  |  |  |  |  |  |  |  |  |  |  |  |  |  |  |  |  |  |  |  |  |  |  |  |  |  |  |  |  |  |  |  |  |  |  |  |  |  |  |  |  |  |  |  |  |  |  |  |  |  |
| Dec-14 | 8.3 |  |  |  |  |  |  |  |  |  |  |  |  |  |  |  |  |  |  |  |  |  |  |  |  |  |  |  |  |  |  |  |  |  |  |  |  |  |  |  |  |  |  |  |  |  |  |  |  |  |  |
| Jan-15 | 9.8 |  |  |  |  |  |  |  |  |  |  |  |  |  |  |  |  |  |  |  |  |  |  |  |  |  |  |  |  |  |  |  |  |  |  |  |  |  |  |  |  |  |  |  |  |  |  |  |  |  |  |
| Feb-15 | 10.6 |  |  |  |  |  |  |  |  |  |  |  |  |  |  |  |  |  |  |  |  |  |  |  |  |  |  |  |  |  |  |  |  |  |  |  |  |  |  |  |  |  |  |  |  |  |  |  |  |  |  |
| Mar-15 | 9.5 |  |  |  |  |  |  |  |  |  |  |  |  |  |  |  |  |  |  |  |  |  |  |  |  |  |  |  |  |  |  |  |  |  |  |  |  |  |  |  |  |  |  |  |  |  |  |  |  |  |  |
| Apr-15 | 7.5 |  |  |  |  |  |  |  |  |  |  |  |  |  |  |  |  |  |  |  |  |  |  |  |  |  |  |  |  |  |  |  |  |  |  |  |  |  |  |  |  |  |  |  |  |  |  |  |  |  |  |
| May-15 | 6.7 |  |  |  |  |  |  |  |  |  |  |  |  |  |  |  |  |  |  |  |  |  |  |  |  |  |  |  |  |  |  |  |  |  |  |  |  |  |  |  |  |  |  |  |  |  |  |  |  |  |  |
| Jun-15 | 6.3 |  |  |  |  |  |  |  |  |  |  |  |  |  |  |  |  |  |  |  |  |  |  |  |  |  |  |  |  |  |  |  |  |  |  |  |  |  |  |  |  |  |  |  |  |  |  |  |  |  |  |
| Jul-15 | 5.5 |  |  |  |  |  |  |  |  |  |  |  |  |  |  |  |  |  |  |  |  |  |  |  |  |  |  |  |  |  |  |  |  |  |  |  |  |  |  |  |  |  |  |  |  |  |  |  |  |  |  |
| Aug-15 | 6.1 |  |  |  |  |  |  |  |  |  |  |  |  |  |  |  |  |  |  |  |  |  |  |  |  |  |  |  |  |  |  |  |  |  |  |  |  |  |  |  |  |  |  |  |  |  |  |  |  |  |  |
| Sep-15 | 5.5 |  |  |  |  |  |  |  |  |  |  |  |  |  |  |  |  |  |  |  |  |  |  |  |  |  |  |  |  |  |  |  |  |  |  |  |  |  |  |  |  |  |  |  |  |  |  |  |  |  |  |
| Oct-15 | 6.2 |  |  |  |  |  |  |  |  |  |  |  |  |  |  |  |  |  |  |  |  |  |  |  |  |  |  |  |  |  |  |  |  |  |  |  |  |  |  |  |  |  |  |  |  |  |  |  |  |  |  |
| Nov-15 | 6.2 |  |  |  |  |  |  |  |  |  |  |  |  |  |  |  |  |  |  |  |  |  |  |  |  |  |  |  |  |  |  |  |  |  |  |  |  |  |  |  |  |  |  |  |  |  |  |  |  |  |  |
| Dec-15 | 7.5 |  |  |  |  |  |  |  |  |  |  |  |  |  |  |  |  |  |  |  |  |  |  |  |  |  |  |  |  |  |  |  |  |  |  |  |  |  |  |  |  |  |  |  |  |  |  |  |  |  |  |
| Jan-16 | 8.5 |  |  |  |  |  |  |  |  |  |  |  |  |  |  |  |  |  |  |  |  |  |  |  |  |  |  |  |  |  |  |  |  |  |  |  |  |  |  |  |  |  |  |  |  |  |  |  |  |  |  |
| Feb-16 | 8.7 |  |  |  |  |  |  |  |  |  |  |  |  |  |  |  |  |  |  |  |  |  |  |  |  |  |  |  |  |  |  |  |  |  |  |  |  |  |  |  |  |  |  |  |  |  |  |  |  |  |  |
| Mar-16 | 8.7 |  |  |  |  |  |  |  |  |  |  |  |  |  |  |  |  |  |  |  |  |  |  |  |  |  |  |  |  |  |  |  |  |  |  |  |  |  |  |  |  |  |  |  |  |  |  |  |  |  |  |
| Apr-16 | 6 |  |  |  |  |  |  |  |  |  |  |  |  |  |  |  |  |  |  |  |  |  |  |  |  |  |  |  |  |  |  |  |  |  |  |  |  |  |  |  |  |  |  |  |  |  |  |  |  |  |  |
| May-16 | 5.2 |  |  |  |  |  |  |  |  |  |  |  |  |  |  |  |  |  |  |  |  |  |  |  |  |  |  |  |  |  |  |  |  |  |  |  |  |  |  |  |  |  |  |  |  |  |  |  |  |  |  |
| Jun-16 | 4.6 |  |  |  |  |  |  |  |  |  |  |  |  |  |  |  |  |  |  |  |  |  |  |  |  |  |  |  |  |  |  |  |  |  |  |  |  |  |  |  |  |  |  |  |  |  |  |  |  |  |  |
| Jul-16 | 4.5 |  |  |  |  |  |  |  |  |  |  |  |  |  |  |  |  |  |  |  |  |  |  |  |  |  |  |  |  |  |  |  |  |  |  |  |  |  |  |  |  |  |  |  |  |  |  |  |  |  |  |
| Aug-16 | 5.1 |  |  |  |  |  |  |  |  |  |  |  |  |  |  |  |  |  |  |  |  |  |  |  |  |  |  |  |  |  |  |  |  |  |  |  |  |  |  |  |  |  |  |  |  |  |  |  |  |  |  |
| Sep-16 | 5.2 |  |  |  |  |  |  |  |  |  |  |  |  |  |  |  |  |  |  |  |  |  |  |  |  |  |  |  |  |  |  |  |  |  |  |  |  |  |  |  |  |  |  |  |  |  |  |  |  |  |  |
| Oct-16 | 5.7 |  |  |  |  |  |  |  |  |  |  |  |  |  |  |  |  |  |  |  |  |  |  |  |  |  |  |  |  |  |  |  |  |  |  |  |  |  |  |  |  |  |  |  |  |  |  |  |  |  |  |
| Nov-16 | 5.7 |  |  |  |  |  |  |  |  |  |  |  |  |  |  |  |  |  |  |  |  |  |  |  |  |  |  |  |  |  |  |  |  |  |  |  |  |  |  |  |  |  |  |  |  |  |  |  |  |  |  |
| Dec-16 | 7.4 |  |  |  |  |  |  |  |  |  |  |  |  |  |  |  |  |  |  |  |  |  |  |  |  |  |  |  |  |  |  |  |  |  |  |  |  |  |  |  |  |  |  |  |  |  |  |  |  |  |  |
| Jan-17 | 9.4 |  |  |  |  |  |  |  |  |  |  |  |  |  |  |  |  |  |  |  |  |  |  |  |  |  |  |  |  |  |  |  |  |  |  |  |  |  |  |  |  |  |  |  |  |  |  |  |  |  |  |
| Feb-17 | 8.8 |  |  |  |  |  |  |  |  |  |  |  |  |  |  |  |  |  |  |  |  |  |  |  |  |  |  |  |  |  |  |  |  |  |  |  |  |  |  |  |  |  |  |  |  |  |  |  |  |  |  |
| Mar-17 | 8.4 |  |  |  |  |  |  |  |  |  |  |  |  |  |  |  |  |  |  |  |  |  |  |  |  |  |  |  |  |  |  |  |  |  |  |  |  |  |  |  |  |  |  |  |  |  |  |  |  |  |  |
| Apr-17 | 6.3 |  |  |  |  |  |  |  |  |  |  |  |  |  |  |  |  |  |  |  |  |  |  |  |  |  |  |  |  |  |  |  |  |  |  |  |  |  |  |  |  |  |  |  |  |  |  |  |  |  |  |
| May-17 | 5.3 |  |  |  |  |  |  |  |  |  |  |  |  |  |  |  |  |  |  |  |  |  |  |  |  |  |  |  |  |  |  |  |  |  |  |  |  |  |  |  |  |  |  |  |  |  |  |  |  |  |  |
| Jun-17 | 4.5 |  |  |  |  |  |  |  |  |  |  |  |  |  |  |  |  |  |  |  |  |  |  |  |  |  |  |  |  |  |  |  |  |  |  |  |  |  |  |  |  |  |  |  |  |  |  |  |  |  |  |
| Jul-17 | 4.9 |  |  |  |  |  |  |  |  |  |  |  |  |  |  |  |  |  |  |  |  |  |  |  |  |  |  |  |  |  |  |  |  |  |  |  |  |  |  |  |  |  |  |  |  |  |  |  |  |  |  |
| Aug-17 | 4.7 |  |  |  |  |  |  |  |  |  |  |  |  |  |  |  |  |  |  |  |  |  |  |  |  |  |  |  |  |  |  |  |  |  |  |  |  |  |  |  |  |  |  |  |  |  |  |  |  |  |  |
| Sep-17 | 4.7 |  |  |  |  |  |  |  |  |  |  |  |  |  |  |  |  |  |  |  |  |  |  |  |  |  |  |  |  |  |  |  |  |  |  |  |  |  |  |  |  |  |  |  |  |  |  |  |  |  |  |
| Oct-17 | 4.5 |  |  |  |  |  |  |  |  |  |  |  |  |  |  |  |  |  |  |  |  |  |  |  |  |  |  |  |  |  |  |  |  |  |  |  |  |  |  |  |  |  |  |  |  |  |  |  |  |  |  |
| Nov-17 | 5 |  |  |  |  |  |  |  |  |  |  |  |  |  |  |  |  |  |  |  |  |  |  |  |  |  |  |  |  |  |  |  |  |  |  |  |  |  |  |  |  |  |  |  |  |  |  |  |  |  |  |
| Dec-17 | 5.9 |  |  |  |  |  |  |  |  |  |  |  |  |  |  |  |  |  |  |  |  |  |  |  |  |  |  |  |  |  |  |  |  |  |  |  |  |  |  |  |  |  |  |  |  |  |  |  |  |  |  |
| Jan-18 | 7.3 |  |  |  |  |  |  |  |  |  |  |  |  |  |  |  |  |  |  |  |  |  |  |  |  |  |  |  |  |  |  |  |  |  |  |  |  |  |  |  |  |  |  |  |  |  |  |  |  |  |  |
| Feb-18 | 7.8 |  |  |  |  |  |  |  |  |  |  |  |  |  |  |  |  |  |  |  |  |  |  |  |  |  |  |  |  |  |  |  |  |  |  |  |  |  |  |  |  |  |  |  |  |  |  |  |  |  |  |
| Mar-18 | 7.4 |  |  |  |  |  |  |  |  |  |  |  |  |  |  |  |  |  |  |  |  |  |  |  |  |  |  |  |  |  |  |  |  |  |  |  |  |  |  |  |  |  |  |  |  |  |  |  |  |  |  |
| Apr-18 | 6.5 |  |  |  |  |  |  |  |  |  |  |  |  |  |  |  |  |  |  |  |  |  |  |  |  |  |  |  |  |  |  |  |  |  |  |  |  |  |  |  |  |  |  |  |  |  |  |  |  |  |  |
| May-18 | 4.4 |  |  |  |  |  |  |  |  |  |  |  |  |  |  |  |  |  |  |  |  |  |  |  |  |  |  |  |  |  |  |  |  |  |  |  |  |  |  |  |  |  |  |  |  |  |  |  |  |  |  |
| Jun-18 | 4.7 |  |  |  |  |  |  |  |  |  |  |  |  |  |  |  |  |  |  |  |  |  |  |  |  |  |  |  |  |  |  |  |  |  |  |  |  |  |  |  |  |  |  |  |  |  |  |  |  |  |  |
| Jul-18 | 3.4 |  |  |  |  |  |  |  |  |  |  |  |  |  |  |  |  |  |  |  |  |  |  |  |  |  |  |  |  |  |  |  |  |  |  |  |  |  |  |  |  |  |  |  |  |  |  |  |  |  |  |
| Aug-18 | 3.4 |  |  |  |  |  |  |  |  |  |  |  |  |  |  |  |  |  |  |  |  |  |  |  |  |  |  |  |  |  |  |  |  |  |  |  |  |  |  |  |  |  |  |  |  |  |  |  |  |  |  |
| Sep-18 | 4.1 |  |  |  |  |  |  |  |  |  |  |  |  |  |  |  |  |  |  |  |  |  |  |  |  |  |  |  |  |  |  |  |  |  |  |  |  |  |  |  |  |  |  |  |  |  |  |  |  |  |  |
| Oct-18 | 3.6 |  |  |  |  |  |  |  |  |  |  |  |  |  |  |  |  |  |  |  |  |  |  |  |  |  |  |  |  |  |  |  |  |  |  |  |  |  |  |  |  |  |  |  |  |  |  |  |  |  |  |
| Nov-18 | 3.9 |  |  |  |  |  |  |  |  |  |  |  |  |  |  |  |  |  |  |  |  |  |  |  |  |  |  |  |  |  |  |  |  |  |  |  |  |  |  |  |  |  |  |  |  |  |  |  |  |  |  |
| Dec-18 | 5.1 |  |  |  |  |  |  |  |  |  |  |  |  |  |  |  |  |  |  |  |  |  |  |  |  |  |  |  |  |  |  |  |  |  |  |  |  |  |  |  |  |  |  |  |  |  |  |  |  |  |  |
| Jan-19 | 6.4 |  |  |  |  |  |  |  |  |  |  |  |  |  |  |  |  |  |  |  |  |  |  |  |  |  |  |  |  |  |  |  |  |  |  |  |  |  |  |  |  |  |  |  |  |  |  |  |  |  |  |
| Feb-19 | 6.2 |  |  |  |  |  |  |  |  |  |  |  |  |  |  |  |  |  |  |  |  |  |  |  |  |  |  |  |  |  |  |  |  |  |  |  |  |  |  |  |  |  |  |  |  |  |  |  |  |  |  |
| Mar-19 | 5.2 |  |  |  |  |  |  |  |  |  |  |  |  |  |  |  |  |  |  |  |  |  |  |  |  |  |  |  |  |  |  |  |  |  |  |  |  |  |  |  |  |  |  |  |  |  |  |  |  |  |  |
| Apr-19 | 4.7 |  |  |  |  |  |  |  |  |  |  |  |  |  |  |  |  |  |  |  |  |  |  |  |  |  |  |  |  |  |  |  |  |  |  |  |  |  |  |  |  |  |  |  |  |  |  |  |  |  |  |
| May-19 | 3.2 |  |  |  |  |  |  |  |  |  |  |  |  |  |  |  |  |  |  |  |  |  |  |  |  |  |  |  |  |  |  |  |  |  |  |  |  |  |  |  |  |  |  |  |  |  |  |  |  |  |  |
| Jun-19 | 4 |  |  |  |  |  |  |  |  |  |  |  |  |  |  |  |  |  |  |  |  |  |  |  |  |  |  |  |  |  |  |  |  |  |  |  |  |  |  |  |  |  |  |  |  |  |  |  |  |  |  |
| Jul-19 | 3.8 |  |  |  |  |  |  |  |  |  |  |  |  |  |  |  |  |  |  |  |  |  |  |  |  |  |  |  |  |  |  |  |  |  |  |  |  |  |  |  |  |  |  |  |  |  |  |  |  |  |  |
| Aug-19 | 3.6 |  |  |  |  |  |  |  |  |  |  |  |  |  |  |  |  |  |  |  |  |  |  |  |  |  |  |  |  |  |  |  |  |  |  |  |  |  |  |  |  |  |  |  |  |  |  |  |  |  |  |
| Sep-19 | 3.2 |  |  |  |  |  |  |  |  |  |  |  |  |  |  |  |  |  |  |  |  |  |  |  |  |  |  |  |  |  |  |  |  |  |  |  |  |  |  |  |  |  |  |  |  |  |  |  |  |  |  |
| Oct-19 | 4 |  |  |  |  |  |  |  |  |  |  |  |  |  |  |  |  |  |  |  |  |  |  |  |  |  |  |  |  |  |  |  |  |  |  |  |  |  |  |  |  |  |  |  |  |  |  |  |  |  |  |
| Nov-19 | 4.4 |  |  |  |  |  |  |  |  |  |  |  |  |  |  |  |  |  |  |  |  |  |  |  |  |  |  |  |  |  |  |  |  |  |  |  |  |  |  |  |  |  |  |  |  |  |  |  |  |  |  |
| Dec-19 | 5 |  |  |  |  |  |  |  |  |  |  |  |  |  |  |  |  |  |  |  |  |  |  |  |  |  |  |  |  |  |  |  |  |  |  |  |  |  |  |  |  |  |  |  |  |  |  |  |  |  |  |
| Jan-20 | 5.4 |  |  |  |  |  |  |  |  |  |  |  |  |  |  |  |  |  |  |  |  |  |  |  |  |  |  |  |  |  |  |  |  |  |  |  |  |  |  |  |  |  |  |  |  |  |  |  |  |  |  |
| Feb-20 | 5.5 |  |  |  |  |  |  |  |  |  |  |  |  |  |  |  |  |  |  |  |  |  |  |  |  |  |  |  |  |  |  |  |  |  |  |  |  |  |  |  |  |  |  |  |  |  |  |  |  |  |  |
| Mar-20 | 6.9 |  |  |  |  |  |  |  |  |  |  |  |  |  |  |  |  |  |  |  |  |  |  |  |  |  |  |  |  |  |  |  |  |  |  |  |  |  |  |  |  |  |  |  |  |  |  |  |  |  |  |
| Apr-20 | 16.6 |  |  |  |  |  |  |  |  |  |  |  |  |  |  |  |  |  |  |  |  |  |  |  |  |  |  |  |  |  |  |  |  |  |  |  |  |  |  |  |  |  |  |  |  |  |  |  |  |  |  |
| May-20 | 12.7 |  |  |  |  |  |  |  |  |  |  |  |  |  |  |  |  |  |  |  |  |  |  |  |  |  |  |  |  |  |  |  |  |  |  |  |  |  |  |  |  |  |  |  |  |  |  |  |  |  |  |
| Jun-20 | 10.1 |  |  |  |  |  |  |  |  |  |  |  |  |  |  |  |  |  |  |  |  |  |  |  |  |  |  |  |  |  |  |  |  |  |  |  |  |  |  |  |  |  |  |  |  |  |  |  |  |  |  |
| Jul-20 | 8.9 |  |  |  |  |  |  |  |  |  |  |  |  |  |  |  |  |  |  |  |  |  |  |  |  |  |  |  |  |  |  |  |  |  |  |  |  |  |  |  |  |  |  |  |  |  |  |  |  |  |  |
| Aug-20 | 7.6 |  |  |  |  |  |  |  |  |  |  |  |  |  |  |  |  |  |  |  |  |  |  |  |  |  |  |  |  |  |  |  |  |  |  |  |  |  |  |  |  |  |  |  |  |  |  |  |  |  |  |
| Sep-20 | 7.1 |  |  |  |  |  |  |  |  |  |  |  |  |  |  |  |  |  |  |  |  |  |  |  |  |  |  |  |  |  |  |  |  |  |  |  |  |  |  |  |  |  |  |  |  |  |  |  |  |  |  |
| Oct-20 | 6.8 |  |  |  |  |  |  |  |  |  |  |  |  |  |  |  |  |  |  |  |  |  |  |  |  |  |  |  |  |  |  |  |  |  |  |  |  |  |  |  |  |  |  |  |  |  |  |  |  |  |  |
| Nov-20 | 7.3 |  |  |  |  |  |  |  |  |  |  |  |  |  |  |  |  |  |  |  |  |  |  |  |  |  |  |  |  |  |  |  |  |  |  |  |  |  |  |  |  |  |  |  |  |  |  |  |  |  |  |
| Dec-20 | 9.6 |  |  |  |  |  |  |  |  |  |  |  |  |  |  |  |  |  |  |  |  |  |  |  |  |  |  |  |  |  |  |  |  |  |  |  |  |  |  |  |  |  |  |  |  |  |  |  |  |  |  |
| Jan-21 | 9.4 |  |  |  |  |  |  |  |  |  |  |  |  |  |  |  |  |  |  |  |  |  |  |  |  |  |  |  |  |  |  |  |  |  |  |  |  |  |  |  |  |  |  |  |  |  |  |  |  |  |  |
| Feb-21 | 9.6 |  |  |  |  |  |  |  |  |  |  |  |  |  |  |  |  |  |  |  |  |  |  |  |  |  |  |  |  |  |  |  |  |  |  |  |  |  |  |  |  |  |  |  |  |  |  |  |  |  |  |
| Mar-21 | 8.6 |  |  |  |  |  |  |  |  |  |  |  |  |  |  |  |  |  |  |  |  |  |  |  |  |  |  |  |  |  |  |  |  |  |  |  |  |  |  |  |  |  |  |  |  |  |  |  |  |  |  |
| Apr-21 | 7.7 |  |  |  |  |  |  |  |  |  |  |  |  |  |  |  |  |  |  |  |  |  |  |  |  |  |  |  |  |  |  |  |  |  |  |  |  |  |  |  |  |  |  |  |  |  |  |  |  |  |  |
| May-21 | 6.7 |  |  |  |  |  |  |  |  |  |  |  |  |  |  |  |  |  |  |  |  |  |  |  |  |  |  |  |  |  |  |  |  |  |  |  |  |  |  |  |  |  |  |  |  |  |  |  |  |  |  |
| Jun-21 | 7.5 |  |  |  |  |  |  |  |  |  |  |  |  |  |  |  |  |  |  |  |  |  |  |  |  |  |  |  |  |  |  |  |  |  |  |  |  |  |  |  |  |  |  |  |  |  |  |  |  |  |  |
| Jul-21 | 6.1 |  |  |  |  |  |  |  |  |  |  |  |  |  |  |  |  |  |  |  |  |  |  |  |  |  |  |  |  |  |  |  |  |  |  |  |  |  |  |  |  |  |  |  |  |  |  |  |  |  |  |
| Aug-21 | 4.6 |  |  |  |  |  |  |  |  |  |  |  |  |  |  |  |  |  |  |  |  |  |  |  |  |  |  |  |  |  |  |  |  |  |  |  |  |  |  |  |  |  |  |  |  |  |  |  |  |  |  |
| Sep-21 | 4.5 |  |  |  |  |  |  |  |  |  |  |  |  |  |  |  |  |  |  |  |  |  |  |  |  |  |  |  |  |  |  |  |  |  |  |  |  |  |  |  |  |  |  |  |  |  |  |  |  |  |  |
| Oct-21 | 4 |  |  |  |  |  |  |  |  |  |  |  |  |  |  |  |  |  |  |  |  |  |  |  |  |  |  |  |  |  |  |  |  |  |  |  |  |  |  |  |  |  |  |  |  |  |  |  |  |  |  |
| Nov-21 | 4.7 |  |  |  |  |  |  |  |  |  |  |  |  |  |  |  |  |  |  |  |  |  |  |  |  |  |  |  |  |  |  |  |  |  |  |  |  |  |  |  |  |  |  |  |  |  |  |  |  |  |  |
| Dec-21 | 5 |  |  |  |  |  |  |  |  |  |  |  |  |  |  |  |  |  |  |  |  |  |  |  |  |  |  |  |  |  |  |  |  |  |  |  |  |  |  |  |  |  |  |  |  |  |  |  |  |  |  |
| Jan-22 | 7.1 |  |  |  |  |  |  |  |  |  |  |  |  |  |  |  |  |  |  |  |  |  |  |  |  |  |  |  |  |  |  |  |  |  |  |  |  |  |  |  |  |  |  |  |  |  |  |  |  |  |  |
| Feb-22 | 6.7 |  |  |  |  |  |  |  |  |  |  |  |  |  |  |  |  |  |  |  |  |  |  |  |  |  |  |  |  |  |  |  |  |  |  |  |  |  |  |  |  |  |  |  |  |  |  |  |  |  |  |
| Mar-22 | 6 |  |  |  |  |  |  |  |  |  |  |  |  |  |  |  |  |  |  |  |  |  |  |  |  |  |  |  |  |  |  |  |  |  |  |  |  |  |  |  |  |  |  |  |  |  |  |  |  |  |  |
| Apr-22 | 4.6 |  |  |  |  |  |  |  |  |  |  |  |  |  |  |  |  |  |  |  |  |  |  |  |  |  |  |  |  |  |  |  |  |  |  |  |  |  |  |  |  |  |  |  |  |  |  |  |  |  |  |
| May-22 | 3.8 |  |  |  |  |  |  |  |  |  |  |  |  |  |  |  |  |  |  |  |  |  |  |  |  |  |  |  |  |  |  |  |  |  |  |  |  |  |  |  |  |  |  |  |  |  |  |  |  |  |  |
| Jun-22 | 3.7 |  |  |  |  |  |  |  |  |  |  |  |  |  |  |  |  |  |  |  |  |  |  |  |  |  |  |  |  |  |  |  |  |  |  |  |  |  |  |  |  |  |  |  |  |  |  |  |  |  |  |
| Jul-22 | 3.5 |  |  |  |  |  |  |  |  |  |  |  |  |  |  |  |  |  |  |  |  |  |  |  |  |  |  |  |  |  |  |  |  |  |  |  |  |  |  |  |  |  |  |  |  |  |  |  |  |  |  |
| Aug-22 | 3.9 |  |  |  |  |  |  |  |  |  |  |  |  |  |  |  |  |  |  |  |  |  |  |  |  |  |  |  |  |  |  |  |  |  |  |  |  |  |  |  |  |  |  |  |  |  |  |  |  |  |  |
| Sep-22 | 3.4 |  |  |  |  |  |  |  |  |  |  |  |  |  |  |  |  |  |  |  |  |  |  |  |  |  |  |  |  |  |  |  |  |  |  |  |  |  |  |  |  |  |  |  |  |  |  |  |  |  |  |
| Oct-22 | 4.1 |  |  |  |  |  |  |  |  |  |  |  |  |  |  |  |  |  |  |  |  |  |  |  |  |  |  |  |  |  |  |  |  |  |  |  |  |  |  |  |  |  |  |  |  |  |  |  |  |  |  |
| Nov-22 | 3.9 |  |  |  |  |  |  |  |  |  |  |  |  |  |  |  |  |  |  |  |  |  |  |  |  |  |  |  |  |  |  |  |  |  |  |  |  |  |  |  |  |  |  |  |  |  |  |  |  |  |  |
| Dec-22 | 4.4 |  |  |  |  |  |  |  |  |  |  |  |  |  |  |  |  |  |  |  |  |  |  |  |  |  |  |  |  |  |  |  |  |  |  |  |  |  |  |  |  |  |  |  |  |  |  |  |  |  |  |